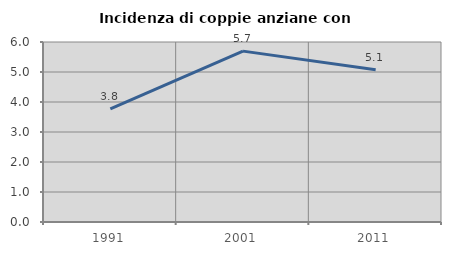
| Category | Incidenza di coppie anziane con figli |
|---|---|
| 1991.0 | 3.774 |
| 2001.0 | 5.696 |
| 2011.0 | 5.072 |